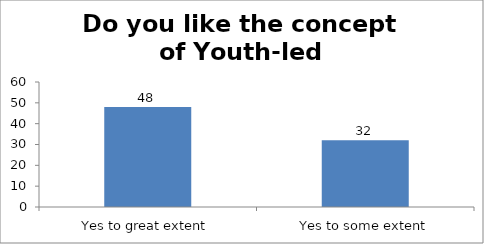
| Category | Do you like the concept of Youth-led Changemaking?  |
|---|---|
| Yes to great extent | 48 |
| Yes to some extent | 32 |